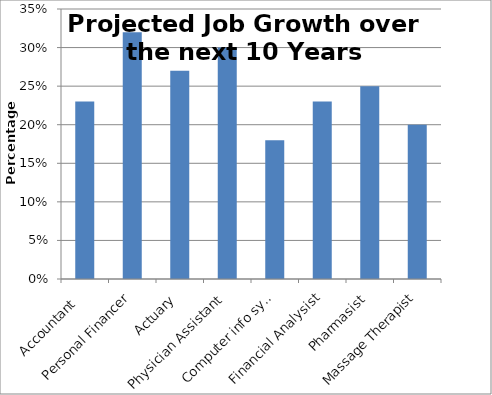
| Category | Series 0 |
|---|---|
| Accountant  | 0.23 |
| Personal Financer | 0.32 |
| Actuary | 0.27 |
| Physician Assistant | 0.3 |
| Computer info sys. | 0.18 |
| Financial Analysist | 0.23 |
| Pharmasist | 0.25 |
| Massage Therapist | 0.2 |